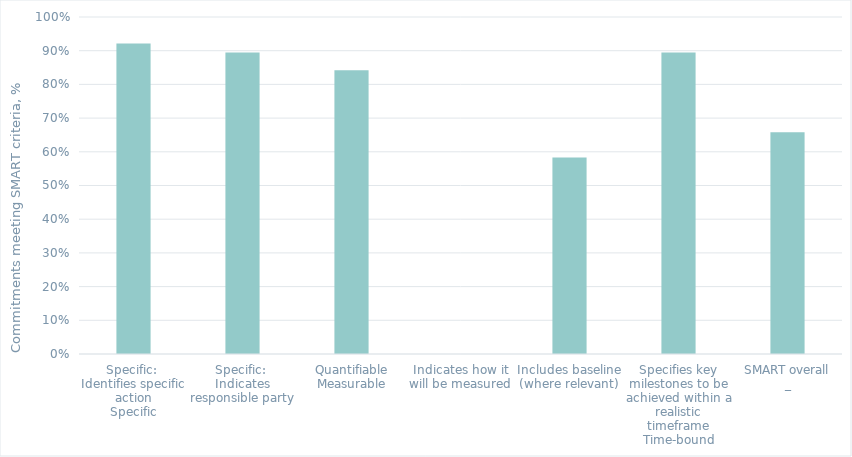
| Category | Series 0 |
|---|---|
| 0 | 0.921 |
| 1 | 0.895 |
| 2 | 0.842 |
| 3 | 0 |
| 4 | 0.583 |
| 5 | 0.895 |
| 6 | 0.658 |